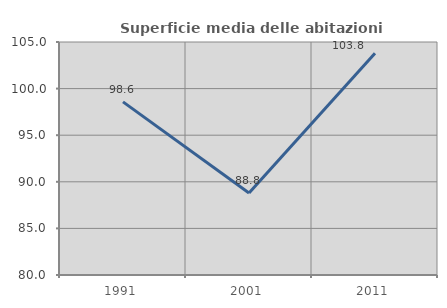
| Category | Superficie media delle abitazioni occupate |
|---|---|
| 1991.0 | 98.573 |
| 2001.0 | 88.794 |
| 2011.0 | 103.802 |